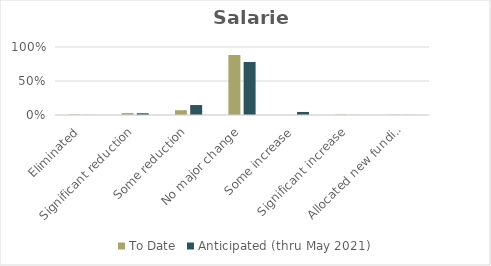
| Category | To Date | Anticipated (thru May 2021) |
|---|---|---|
| Eliminated | 0.008 | 0.001 |
| Significant reduction | 0.029 | 0.025 |
| Some reduction | 0.07 | 0.147 |
| No major change | 0.883 | 0.78 |
| Some increase | 0.001 | 0.045 |
| Significant increase | 0.006 | 0.001 |
| Allocated new funding | 0.004 | 0.001 |